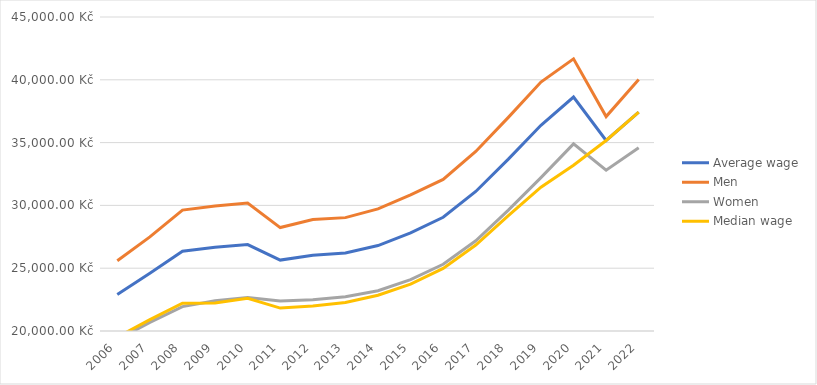
| Category | Average wage | Men | Women | Median wage |
|---|---|---|---|---|
| 2006.0 | 22908 | 25593 | 19305 | 19512 |
| 2007.0 | 24604 | 27489 | 20684 | 20908 |
| 2008.0 | 26349 | 29628 | 21939 | 22217 |
| 2009.0 | 26677 | 29953 | 22414 | 22229 |
| 2010.0 | 26881 | 30192 | 22666 | 22608 |
| 2011.0 | 25645 | 28234 | 22389 | 21826 |
| 2012.0 | 26033 | 28873 | 22496 | 21997 |
| 2013.0 | 26211 | 29026 | 22729 | 22266 |
| 2014.0 | 26802 | 29721 | 23203 | 22844 |
| 2015.0 | 27811 | 30842 | 24094 | 23726 |
| 2016.0 | 29056 | 32065 | 25309 | 24982 |
| 2017.0 | 31109 | 34293 | 27187 | 26843 |
| 2018.0 | 33684 | 37008 | 29627 | 29184 |
| 2019.0 | 36380 | 39820 | 32207 | 31449 |
| 2020.0 | 38628 | 41667 | 34899 | 33195 |
| 2021.0 | 35169 | 37070 | 32800 | 35169 |
| 2022.0 | 37418 | 40020 | 34587 | 37418 |